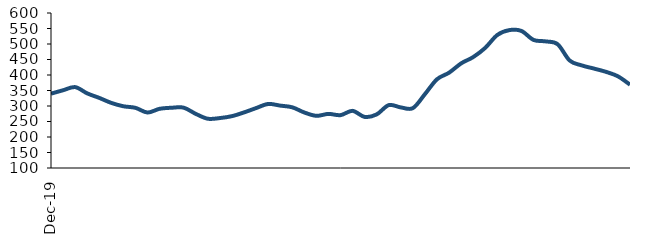
| Category | Series 0 |
|---|---|
| 2019-12-01 | 339.824 |
| 2020-01-01 | 350.768 |
| 2020-02-01 | 360.883 |
| 2020-03-01 | 340.754 |
| 2020-04-01 | 326.108 |
| 2020-05-01 | 309.949 |
| 2020-06-01 | 299.181 |
| 2020-07-01 | 294.112 |
| 2020-08-01 | 278.992 |
| 2020-09-01 | 290.987 |
| 2020-10-01 | 294.359 |
| 2020-11-01 | 294.596 |
| 2020-12-01 | 274.651 |
| 2021-01-01 | 258.932 |
| 2021-02-01 | 261.112 |
| 2021-03-01 | 267.235 |
| 2021-04-01 | 279.241 |
| 2021-05-01 | 293.25 |
| 2021-06-01 | 306.524 |
| 2021-07-01 | 301.301 |
| 2021-08-01 | 295.799 |
| 2021-09-01 | 279.082 |
| 2021-10-01 | 268.296 |
| 2021-11-01 | 274.558 |
| 2021-12-01 | 270.511 |
| 2022-01-01 | 284.312 |
| 2022-02-01 | 264.809 |
| 2022-03-01 | 272.939 |
| 2022-04-01 | 302.833 |
| 2022-05-01 | 295.467 |
| 2022-06-01 | 293.185 |
| 2022-07-01 | 338.335 |
| 2022-08-01 | 386.233 |
| 2022-09-01 | 407.447 |
| 2022-10-01 | 437.443 |
| 2022-11-01 | 457.804 |
| 2022-12-01 | 487.578 |
| 2023-01-01 | 529.085 |
| 2023-02-01 | 544.808 |
| 2023-03-01 | 542.145 |
| 2023-04-01 | 513.135 |
| 2023-05-01 | 508.445 |
| 2023-06-01 | 499.29 |
| 2023-07-01 | 446.623 |
| 2023-08-01 | 430.971 |
| 2023-09-01 | 420.849 |
| 2023-10-01 | 410.302 |
| 2023-11-01 | 395.771 |
| 2023-12-01 | 368.753 |